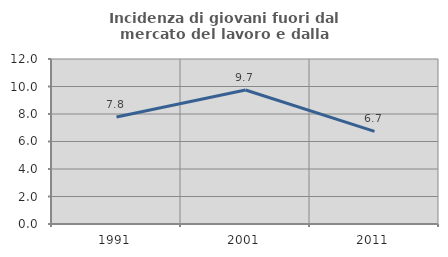
| Category | Incidenza di giovani fuori dal mercato del lavoro e dalla formazione  |
|---|---|
| 1991.0 | 7.778 |
| 2001.0 | 9.746 |
| 2011.0 | 6.736 |